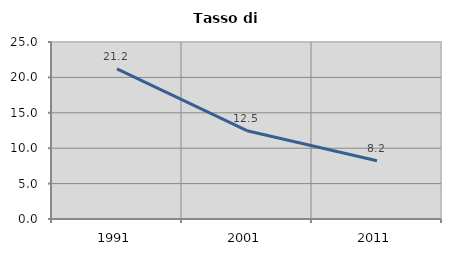
| Category | Tasso di disoccupazione   |
|---|---|
| 1991.0 | 21.198 |
| 2001.0 | 12.474 |
| 2011.0 | 8.233 |